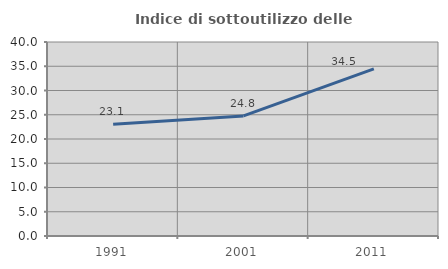
| Category | Indice di sottoutilizzo delle abitazioni  |
|---|---|
| 1991.0 | 23.059 |
| 2001.0 | 24.75 |
| 2011.0 | 34.476 |